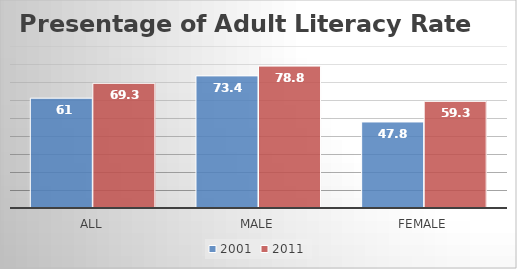
| Category | 2001 | 2011 |
|---|---|---|
| All | 61 | 69.277 |
| Male | 73.4 | 78.839 |
| Female | 47.8 | 59.262 |